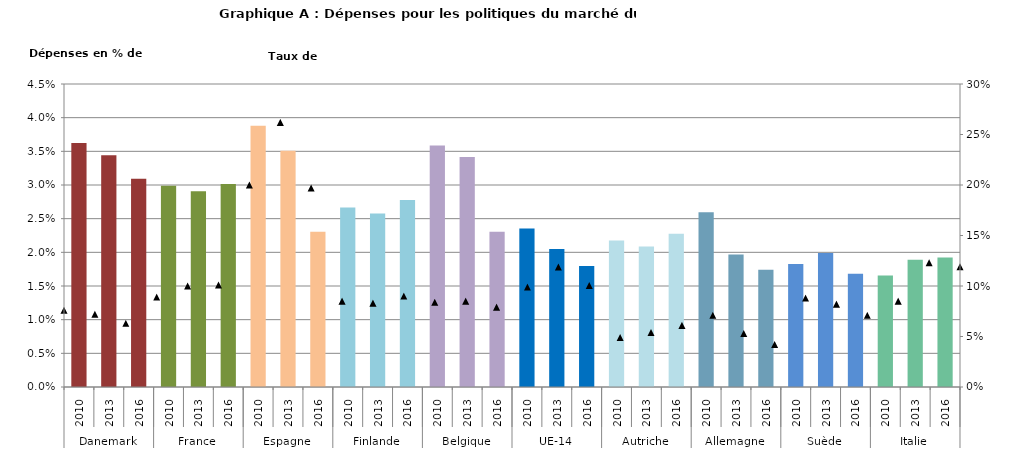
| Category | Dépenses PMT (% du PIB) |
|---|---|
| 0 | 0.036 |
| 1 | 0.034 |
| 2 | 0.031 |
| 3 | 0.03 |
| 4 | 0.029 |
| 5 | 0.03 |
| 6 | 0.039 |
| 7 | 0.035 |
| 8 | 0.023 |
| 9 | 0.027 |
| 10 | 0.026 |
| 11 | 0.028 |
| 12 | 0.036 |
| 13 | 0.034 |
| 14 | 0.023 |
| 15 | 0.024 |
| 16 | 0.021 |
| 17 | 0.018 |
| 18 | 0.022 |
| 19 | 0.021 |
| 20 | 0.023 |
| 21 | 0.026 |
| 22 | 0.02 |
| 23 | 0.017 |
| 24 | 0.018 |
| 25 | 0.02 |
| 26 | 0.017 |
| 27 | 0.017 |
| 28 | 0.019 |
| 29 | 0.019 |